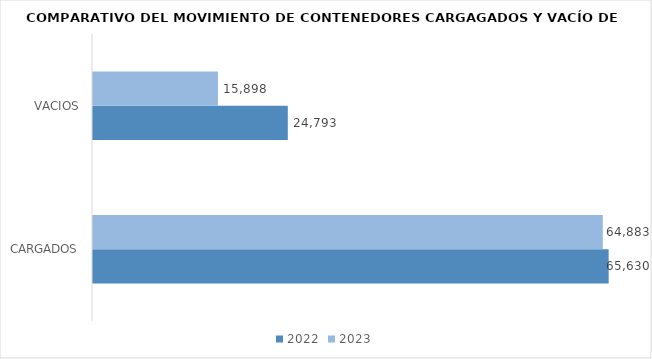
| Category | 2022 | 2023 |
|---|---|---|
| CARGADOS | 65630 | 64882.75 |
| VACIOS | 24793 | 15897.75 |